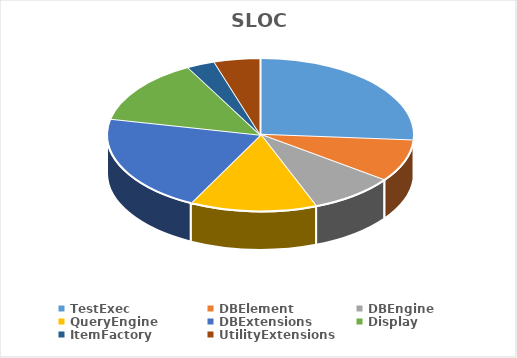
| Category | SLOC | Active | Generic |
|---|---|---|---|
| TestExec | 558 | 558 | 14 |
| DBElement | 189 | 171 | 171 |
| DBEngine | 192 | 175 | 175 |
| QueryEngine | 285 | 192 | 192 |
| DBExtensions | 444 | 189 | 189 |
| Display | 294 | 165 | 165 |
| ItemFactory | 63 | 54 | 54 |
| UtilityExtensions | 104 | 95 | 43 |